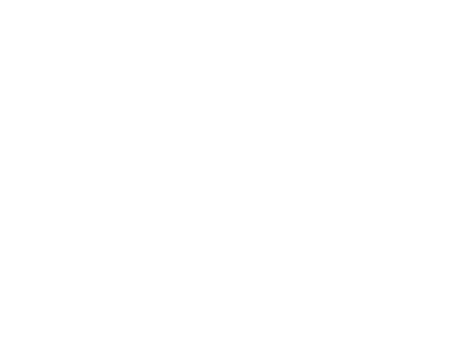
| Category | קרן ששולמה | ריבית ששולמה |
|---|---|---|
| 2022 | 3778.844 | 2732.733 |
| 2023 | 19423.454 | 13134.429 |
| 2024 | 35950.543 | 22653.647 |
| 2025 | 53409.891 | 31240.606 |
| 2026 | 71854.082 | 38842.721 |
| 2027 | 91338.671 | 45404.439 |
| 2028 | 111922.344 | 50867.073 |
| 2029 | 133667.098 | 55168.625 |
| 2030 | 156638.427 | 58243.603 |
| 2031 | 180905.52 | 60022.817 |
| 2032 | 200000 | 60463.067 |